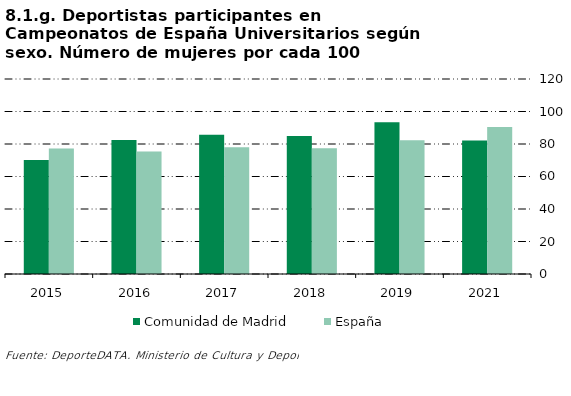
| Category | Comunidad de Madrid | España |
|---|---|---|
| 2015 | 70.111 | 77.236 |
| 2016 | 82.484 | 75.311 |
| 2017 | 85.672 | 77.94 |
| 2018 | 84.916 | 77.394 |
| 2019 | 93.316 | 82.261 |
| 2021 | 82.105 | 90.487 |